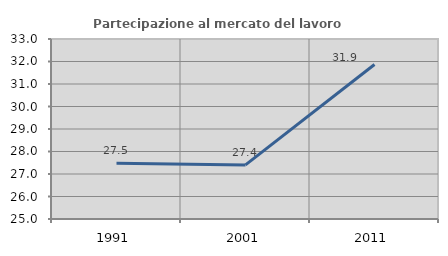
| Category | Partecipazione al mercato del lavoro  femminile |
|---|---|
| 1991.0 | 27.482 |
| 2001.0 | 27.405 |
| 2011.0 | 31.868 |